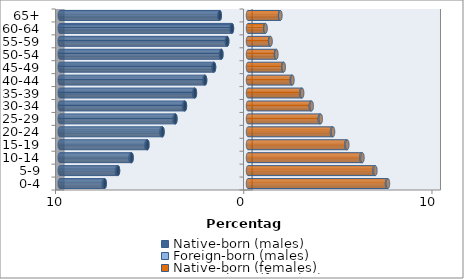
| Category | Native-born (males) | Foreign-born (males) | Native-born (females) | Foreign-born (females) |
|---|---|---|---|---|
| 0-4 | -7.613 | -0.056 | 7.383 | 0.053 |
| 5-9 | -6.906 | -0.061 | 6.711 | 0.058 |
| 10-14 | -6.185 | -0.061 | 6.024 | 0.058 |
| 15-19 | -5.344 | -0.057 | 5.221 | 0.055 |
| 20-24 | -4.542 | -0.06 | 4.462 | 0.058 |
| 25-29 | -3.855 | -0.055 | 3.813 | 0.053 |
| 30-34 | -3.351 | -0.051 | 3.336 | 0.049 |
| 35-39 | -2.82 | -0.044 | 2.836 | 0.043 |
| 40-44 | -2.28 | -0.038 | 2.325 | 0.037 |
| 45-49 | -1.804 | -0.031 | 1.869 | 0.03 |
| 50-54 | -1.414 | -0.026 | 1.484 | 0.026 |
| 55-59 | -1.105 | -0.022 | 1.175 | 0.023 |
| 60-64 | -0.852 | -0.019 | 0.913 | 0.02 |
| 65+ | -1.501 | -0.015 | 1.702 | 0.016 |